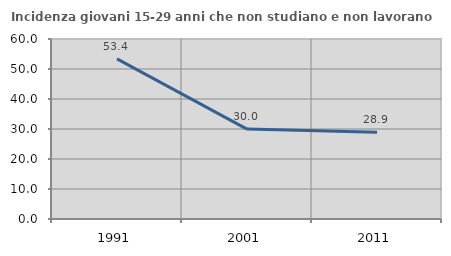
| Category | Incidenza giovani 15-29 anni che non studiano e non lavorano  |
|---|---|
| 1991.0 | 53.388 |
| 2001.0 | 29.972 |
| 2011.0 | 28.877 |